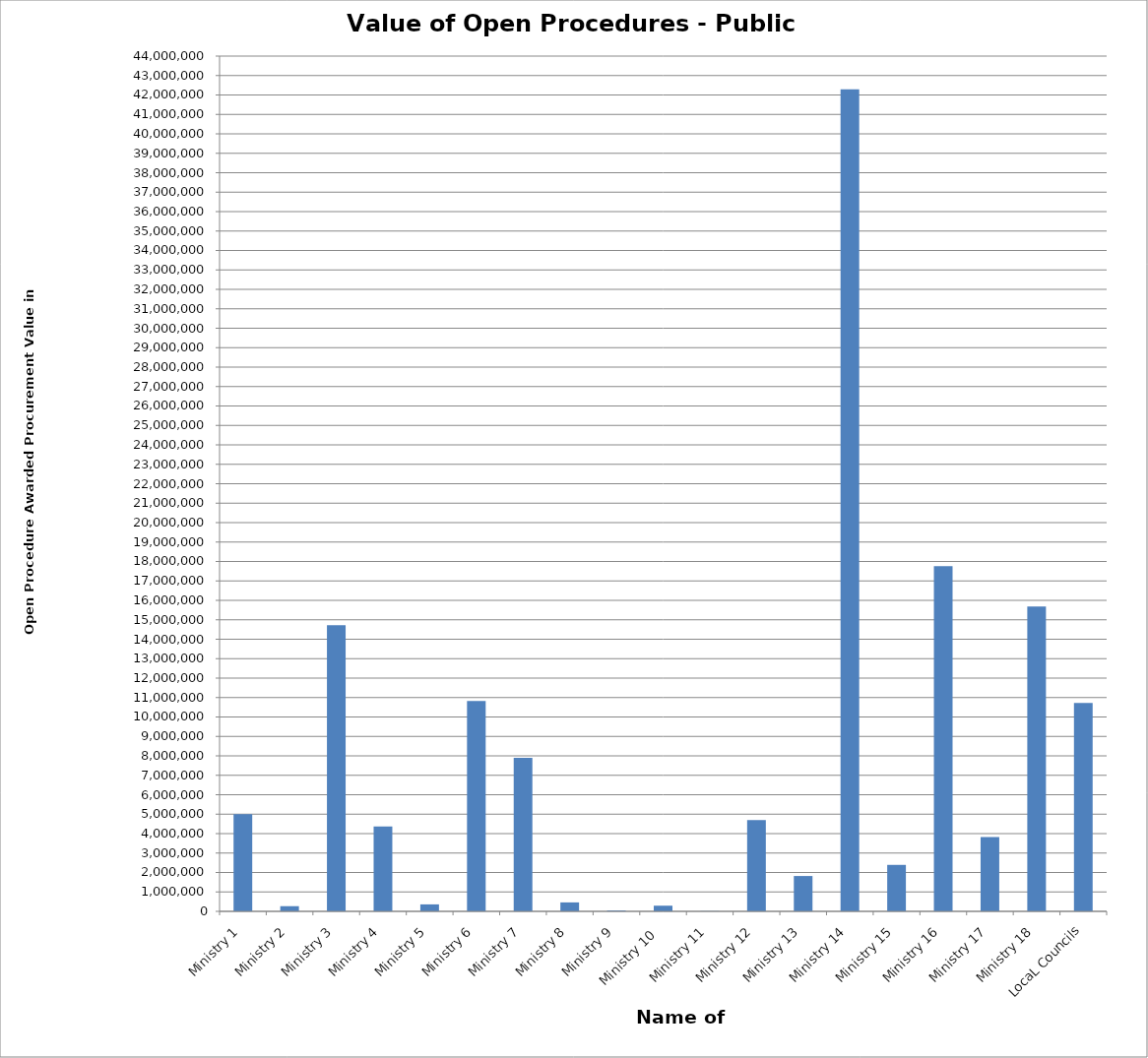
| Category | Series 0 |
|---|---|
| Ministry 1 | 5006154.83 |
| Ministry 2 | 266651.86 |
| Ministry 3 | 14724070.63 |
| Ministry 4 | 4362188.12 |
| Ministry 5 | 359079.97 |
| Ministry 6 | 10826807.71 |
| Ministry 7 | 7899291.83 |
| Ministry 8 | 460430.75 |
| Ministry 9 | 45115 |
| Ministry 10  | 291231.2 |
| Ministry 11 | 10705 |
| Ministry 12 | 4694309.08 |
| Ministry 13 | 1818681.58 |
| Ministry 14 | 42295096.06 |
| Ministry 15 | 2390740.12 |
| Ministry 16 | 17753863.58 |
| Ministry 17 | 3824209.23 |
| Ministry 18 | 15682893.04 |
| LocaL Councils | 10717454.6 |